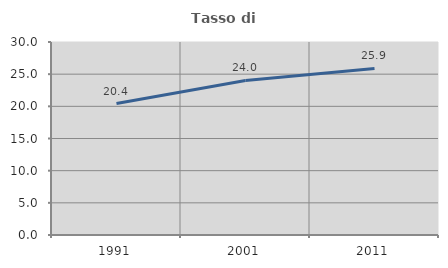
| Category | Tasso di occupazione   |
|---|---|
| 1991.0 | 20.436 |
| 2001.0 | 24.029 |
| 2011.0 | 25.897 |